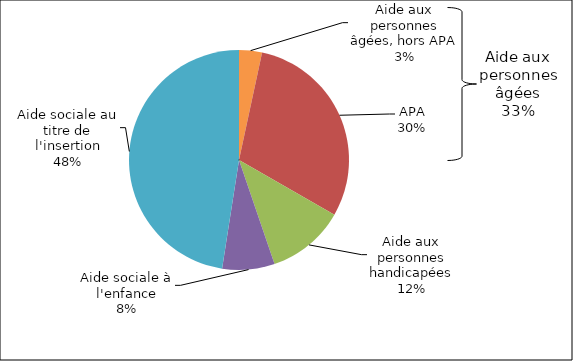
| Category | Series 0 |
|---|---|
| Aide aux personnes âgées, hors APA | 141020 |
| APA | 1251840 |
| Aide aux personnes handicapées | 479750 |
| Aide sociale à l'enfance | 322050 |
| Aide sociale au titre de l'insertion | 1988650 |